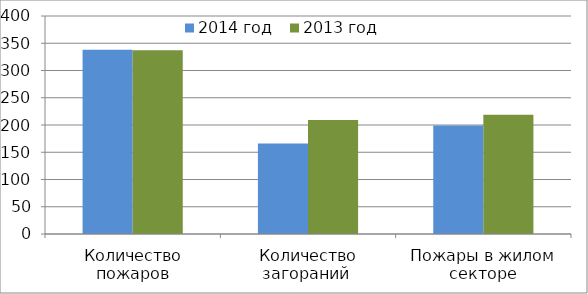
| Category | 2014 год | 2013 год |
|---|---|---|
| Количество пожаров | 338 | 337 |
| Количество загораний  | 166 | 209 |
| Пожары в жилом секторе | 199 | 219 |